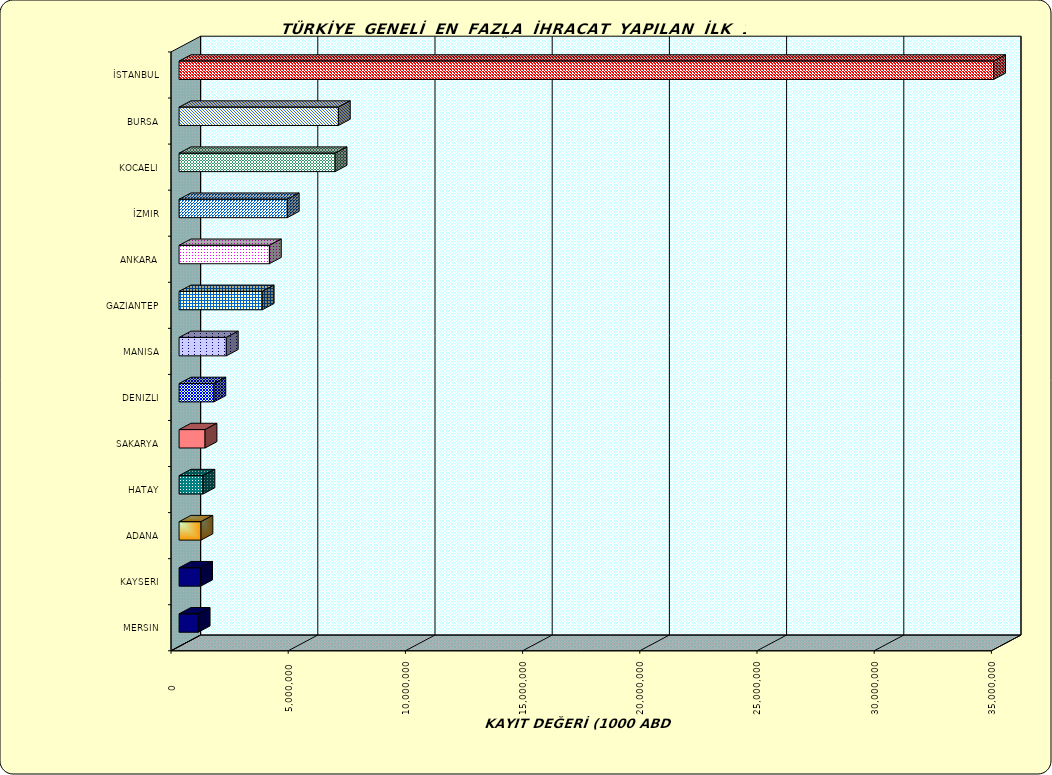
| Category | Series 0 |
|---|---|
| İSTANBUL | 34751857.403 |
| BURSA | 6796797.407 |
| KOCAELI | 6657365.38 |
| İZMIR | 4616345.918 |
| ANKARA | 3854077.044 |
| GAZIANTEP | 3548694.149 |
| MANISA | 2015941.914 |
| DENIZLI | 1485696.947 |
| SAKARYA | 1108725.296 |
| HATAY | 1019911.988 |
| ADANA | 934644.788 |
| KAYSERI | 921167.065 |
| MERSIN | 816296.223 |